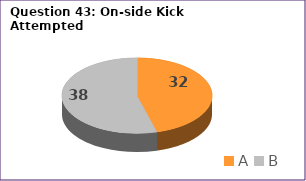
| Category | Series 0 |
|---|---|
| A | 32 |
| B | 38 |